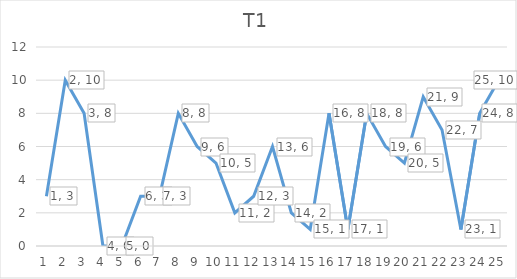
| Category | T1 |
|---|---|
| 0 | 3 |
| 1 | 10 |
| 2 | 8 |
| 3 | 0 |
| 4 | 0 |
| 5 | 3 |
| 6 | 3 |
| 7 | 8 |
| 8 | 6 |
| 9 | 5 |
| 10 | 2 |
| 11 | 3 |
| 12 | 6 |
| 13 | 2 |
| 14 | 1 |
| 15 | 8 |
| 16 | 1 |
| 17 | 8 |
| 18 | 6 |
| 19 | 5 |
| 20 | 9 |
| 21 | 7 |
| 22 | 1 |
| 23 | 8 |
| 24 | 10 |